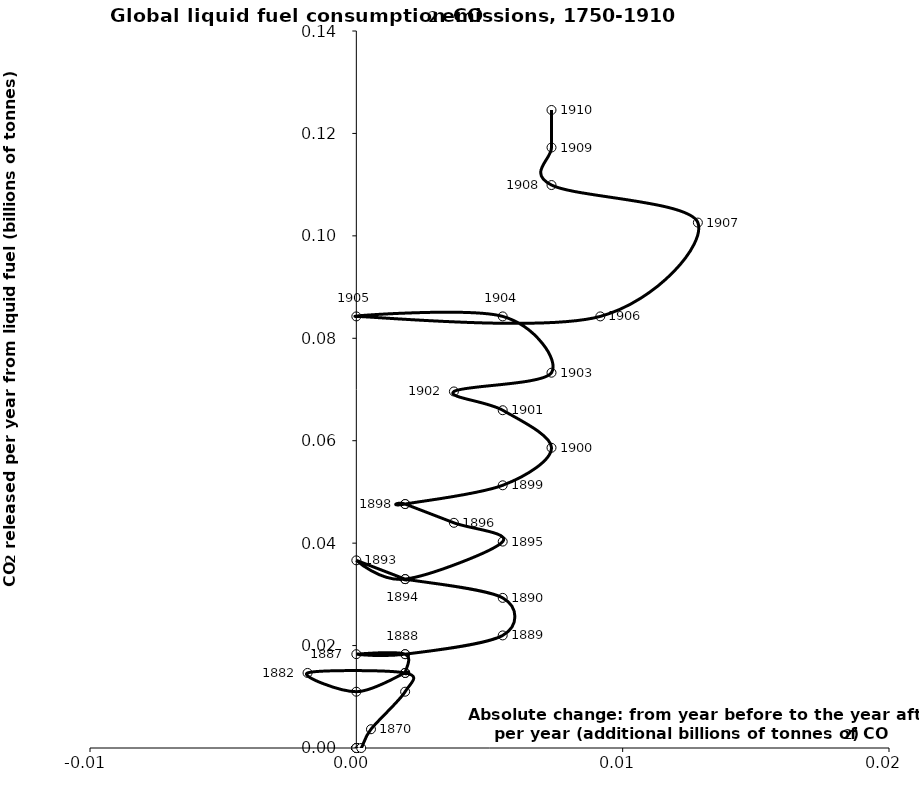
| Category | Series 0 |
|---|---|
| 0.0 | 0 |
| 0.0 | 0 |
| 0.0 | 0 |
| 0.0 | 0 |
| 0.0 | 0 |
| 0.0 | 0 |
| 0.0 | 0 |
| 0.0 | 0 |
| 0.0 | 0 |
| 0.0 | 0 |
| 0.0 | 0 |
| 0.0001832 | 0 |
| 0.0005496 | 0.004 |
| 0.0018320000000000003 | 0.011 |
| 0.0018320000000000003 | 0.015 |
| -0.0018320000000000003 | 0.015 |
| 0.0 | 0.011 |
| 0.0018320000000000003 | 0.015 |
| 0.0018319999999999994 | 0.015 |
| 0.0018319999999999994 | 0.018 |
| 0.0 | 0.018 |
| 0.0018320000000000003 | 0.018 |
| 0.005496000000000001 | 0.022 |
| 0.005495999999999999 | 0.029 |
| 0.0018319999999999986 | 0.033 |
| 0.0018320000000000003 | 0.033 |
| 0.0 | 0.037 |
| 0.0018320000000000003 | 0.033 |
| 0.005496000000000001 | 0.04 |
| 0.0036640000000000006 | 0.044 |
| 0.0018320000000000003 | 0.048 |
| 0.0018320000000000003 | 0.048 |
| 0.005496000000000001 | 0.051 |
| 0.007327999999999998 | 0.059 |
| 0.005495999999999997 | 0.066 |
| 0.0036640000000000006 | 0.07 |
| 0.007328000000000001 | 0.073 |
| 0.005496000000000001 | 0.084 |
| 0.0 | 0.084 |
| 0.009160000000000001 | 0.084 |
| 0.012824000000000002 | 0.103 |
| 0.007328000000000001 | 0.11 |
| 0.007328000000000008 | 0.117 |
| 0.007327999999999994 | 0.125 |